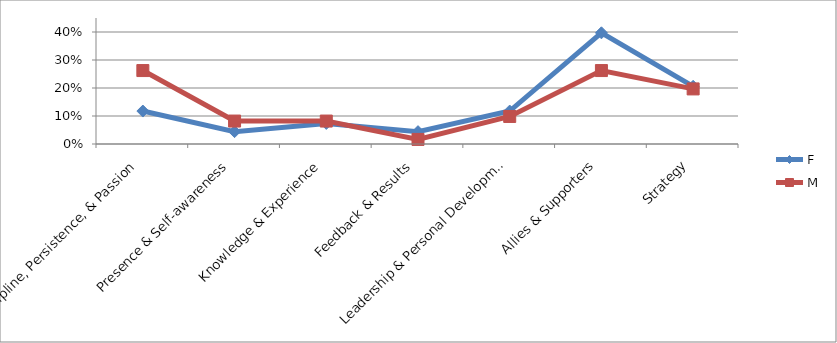
| Category | F | M |
|---|---|---|
| Discipline, Persistence, & Passion | 0.118 | 0.262 |
| Presence & Self-awareness | 0.044 | 0.082 |
| Knowledge & Experience | 0.074 | 0.082 |
| Feedback & Results | 0.044 | 0.016 |
| Leadership & Personal Development | 0.118 | 0.098 |
| Allies & Supporters | 0.397 | 0.262 |
| Strategy | 0.206 | 0.197 |